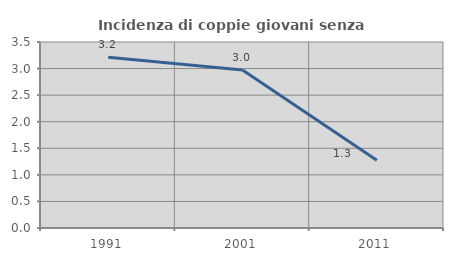
| Category | Incidenza di coppie giovani senza figli |
|---|---|
| 1991.0 | 3.214 |
| 2001.0 | 2.974 |
| 2011.0 | 1.274 |